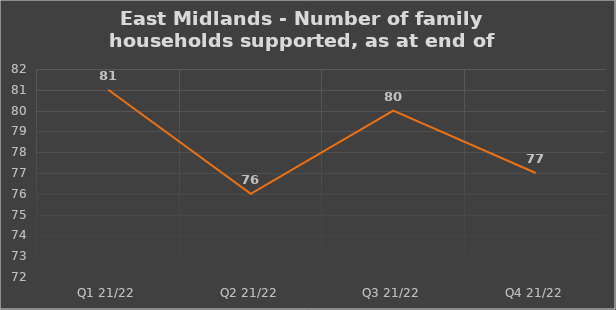
| Category | Number of financially supported households at end of quarter |
|---|---|
| Q1 21/22 | 81 |
| Q2 21/22 | 76 |
| Q3 21/22 | 80 |
| Q4 21/22 | 77 |